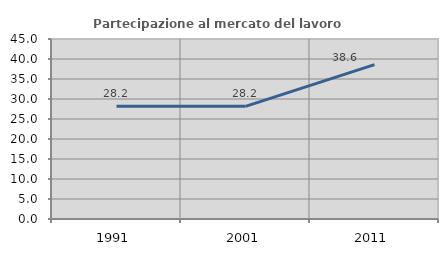
| Category | Partecipazione al mercato del lavoro  femminile |
|---|---|
| 1991.0 | 28.16 |
| 2001.0 | 28.166 |
| 2011.0 | 38.608 |